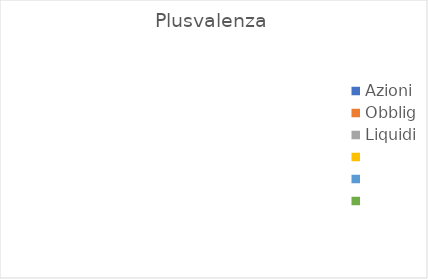
| Category | Plusvalenza |
|---|---|
| Azioni | 0 |
| Obblig | 0 |
| Liquidi | 0 |